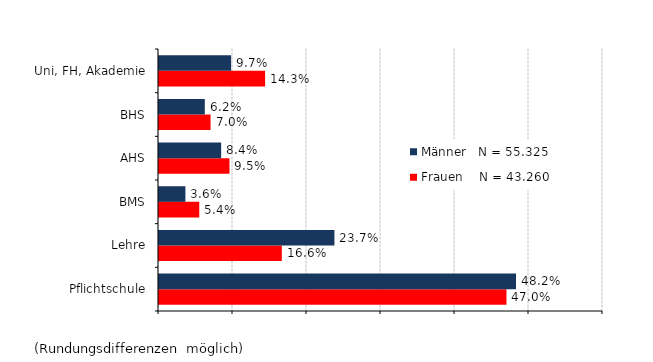
| Category | Frauen    N = 43.260 | Männer   N = 55.325 |
|---|---|---|
| Pflichtschule | 0.47 | 0.482 |
| Lehre | 0.166 | 0.237 |
| BMS | 0.054 | 0.036 |
| AHS | 0.095 | 0.084 |
| BHS | 0.07 | 0.062 |
| Uni, FH, Akademie | 0.143 | 0.097 |